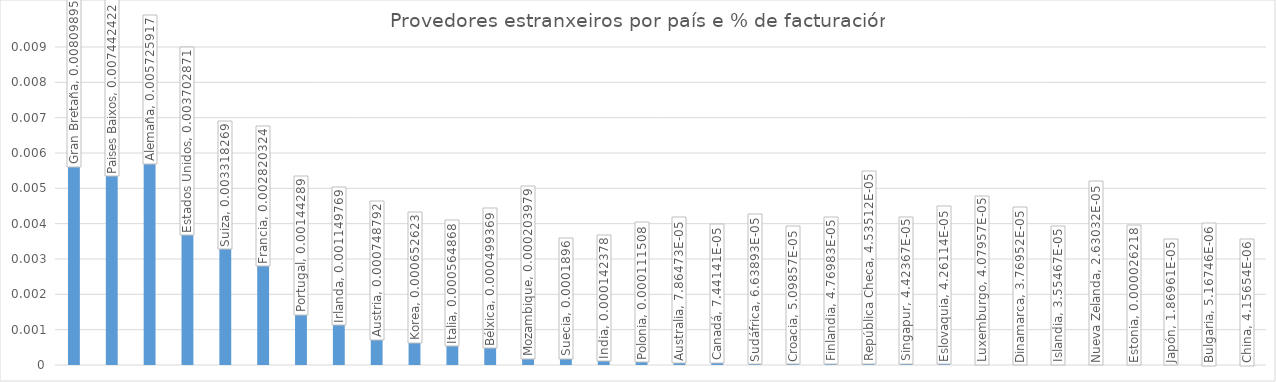
| Category | Series 0 |
|---|---|
| Gran Bretaña | 0.008 |
| Paises Baixos | 0.007 |
| Alemaña | 0.006 |
| Estados Unidos | 0.004 |
| Suiza | 0.003 |
| Francia | 0.003 |
| Portugal | 0.001 |
| Irlanda | 0.001 |
| Austria | 0.001 |
| Korea | 0.001 |
| Italia | 0.001 |
| Bélxica | 0 |
| Mozambique | 0 |
| Suecia | 0 |
| India | 0 |
| Polonia | 0 |
| Australia | 0 |
| Canadá | 0 |
| Sudáfrica | 0 |
| Croacia | 0 |
| Finlandia | 0 |
| República Checa | 0 |
| Singapur | 0 |
| Eslovaquia | 0 |
| Luxemburgo | 0 |
| Dinamarca | 0 |
| Islandia | 0 |
| Nueva Zelanda | 0 |
| Estonia | 0 |
| Japón | 0 |
| Bulgaria | 0 |
| China | 0 |